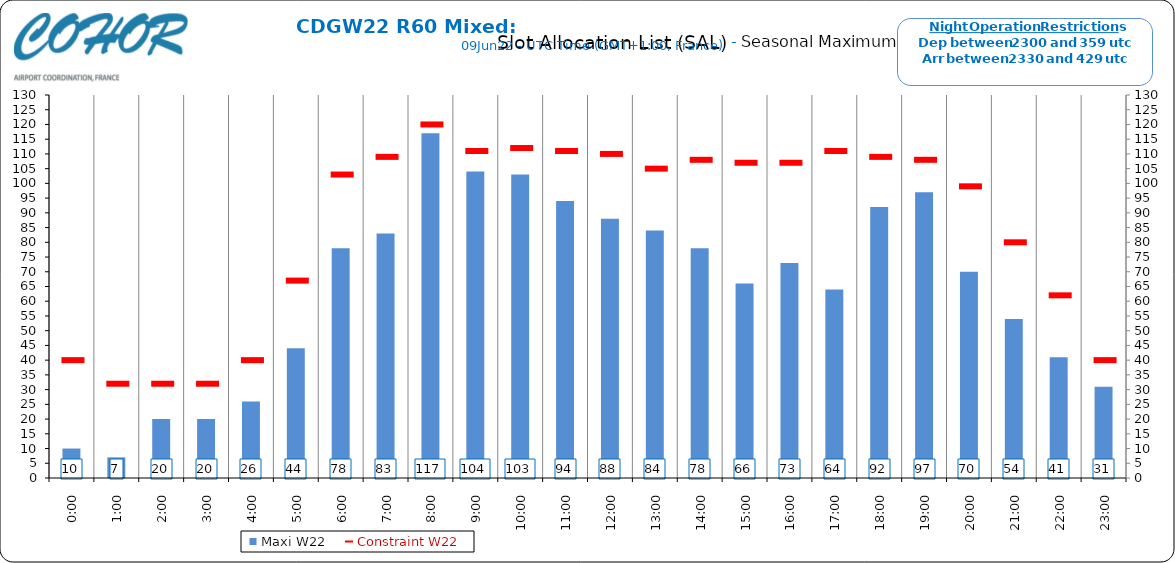
| Category | Maxi W22 |
|---|---|
| 0:00 | 10 |
| 1:00 | 7 |
| 2:00 | 20 |
| 3:00 | 20 |
| 4:00 | 26 |
| 5:00 | 44 |
| 6:00 | 78 |
| 7:00 | 83 |
| 8:00 | 117 |
| 9:00 | 104 |
| 10:00 | 103 |
| 11:00 | 94 |
| 12:00 | 88 |
| 13:00 | 84 |
| 14:00 | 78 |
| 15:00 | 66 |
| 16:00 | 73 |
| 17:00 | 64 |
| 18:00 | 92 |
| 19:00 | 97 |
| 20:00 | 70 |
| 21:00 | 54 |
| 22:00 | 41 |
| 23:00 | 31 |